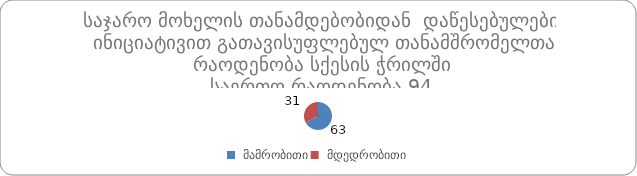
| Category | Series 0 |
|---|---|
|  მამრობითი | 63 |
|  მდედრობითი | 31 |